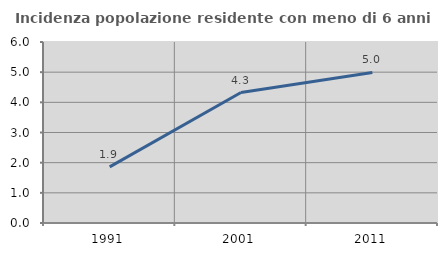
| Category | Incidenza popolazione residente con meno di 6 anni |
|---|---|
| 1991.0 | 1.861 |
| 2001.0 | 4.324 |
| 2011.0 | 4.991 |